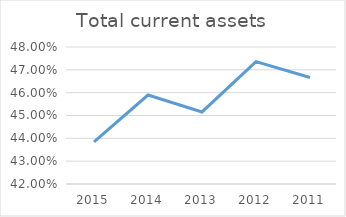
| Category | Total current assets |
|---|---|
| 2015.0 | 0.438 |
| 2014.0 | 0.459 |
| 2013.0 | 0.452 |
| 2012.0 | 0.474 |
| 2011.0 | 0.467 |